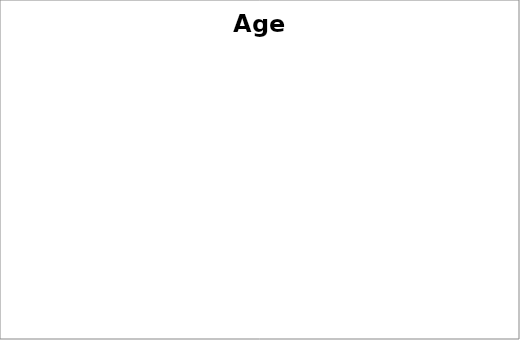
| Category | Series 0 |
|---|---|
| Aged 10 and under | 0 |
| Aged 11 | 0 |
| Aged 12 | 0 |
| Aged 13 | 0 |
| Aged 14 and over | 0 |